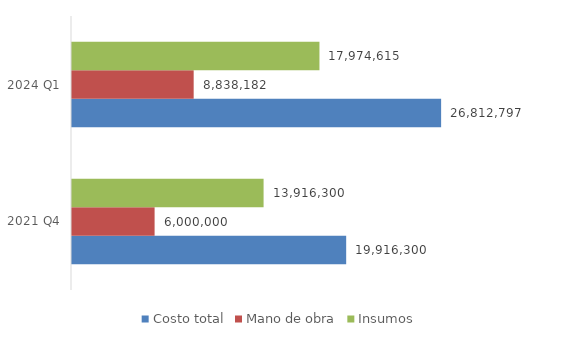
| Category | Costo total | Mano de obra | Insumos |
|---|---|---|---|
| 2021 Q4 | 19916300 | 6000000 | 13916300 |
| 2024 Q1 | 26812796.751 | 8838182 | 17974614.751 |